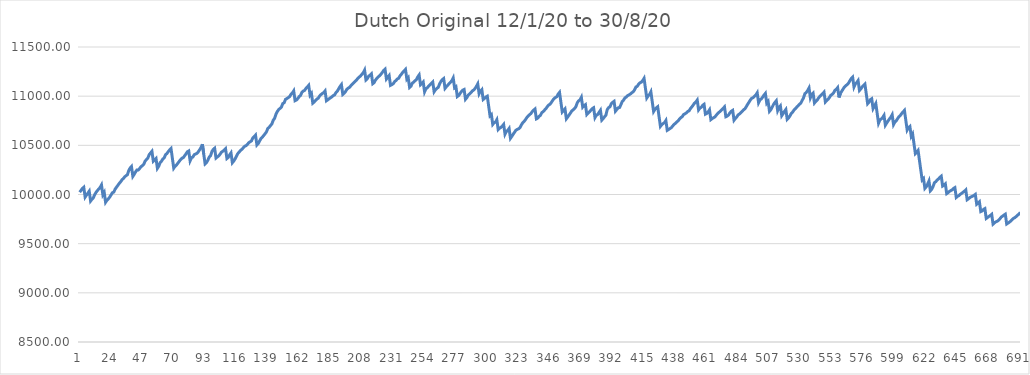
| Category | Series 0 |
|---|---|
| 0 | 10023.333 |
| 1 | 10042.179 |
| 2 | 10061.779 |
| 3 | 10073.644 |
| 4 | 9973.644 |
| 5 | 9994.948 |
| 6 | 10013.3 |
| 7 | 10033.717 |
| 8 | 9933.717 |
| 9 | 9952.001 |
| 10 | 9966.001 |
| 11 | 9998.667 |
| 12 | 10021.564 |
| 13 | 10040.302 |
| 14 | 10055.473 |
| 15 | 10072.225 |
| 16 | 10097.289 |
| 17 | 9997.289 |
| 18 | 10020.847 |
| 19 | 9920.847 |
| 20 | 9941.435 |
| 21 | 9955.375 |
| 22 | 9972.969 |
| 23 | 9995.041 |
| 24 | 10018.209 |
| 25 | 10024.968 |
| 26 | 10053.791 |
| 27 | 10074.642 |
| 28 | 10092.724 |
| 29 | 10112.602 |
| 30 | 10128.615 |
| 31 | 10148.615 |
| 32 | 10161.717 |
| 33 | 10179.217 |
| 34 | 10191.315 |
| 35 | 10200.233 |
| 36 | 10243.595 |
| 37 | 10269.25 |
| 38 | 10284.562 |
| 39 | 10184.562 |
| 40 | 10205.413 |
| 41 | 10229.913 |
| 42 | 10249.913 |
| 43 | 10249.913 |
| 44 | 10264.432 |
| 45 | 10283.278 |
| 46 | 10292.506 |
| 47 | 10306.918 |
| 48 | 10339.584 |
| 49 | 10355.391 |
| 50 | 10370.824 |
| 51 | 10405.21 |
| 52 | 10422.741 |
| 53 | 10439.351 |
| 54 | 10339.351 |
| 55 | 10353.174 |
| 56 | 10366.417 |
| 57 | 10266.417 |
| 58 | 10287.447 |
| 59 | 10324.851 |
| 60 | 10337.746 |
| 61 | 10361.08 |
| 62 | 10372.475 |
| 63 | 10405.583 |
| 64 | 10416.472 |
| 65 | 10436.431 |
| 66 | 10453.328 |
| 67 | 10467.572 |
| 68 | 10367.572 |
| 69 | 10267.572 |
| 70 | 10287.172 |
| 71 | 10299.123 |
| 72 | 10317.969 |
| 73 | 10336.852 |
| 74 | 10354.352 |
| 75 | 10369.178 |
| 76 | 10374.58 |
| 77 | 10394.219 |
| 78 | 10413.066 |
| 79 | 10434.51 |
| 80 | 10442.643 |
| 81 | 10342.643 |
| 82 | 10373.754 |
| 83 | 10380.425 |
| 84 | 10404.327 |
| 85 | 10411.327 |
| 86 | 10418.866 |
| 87 | 10433.943 |
| 88 | 10454.973 |
| 89 | 10477.245 |
| 90 | 10511.392 |
| 91 | 10411.392 |
| 92 | 10311.392 |
| 93 | 10324.287 |
| 94 | 10348.484 |
| 95 | 10380.097 |
| 96 | 10393.784 |
| 97 | 10437.34 |
| 98 | 10458.973 |
| 99 | 10470.838 |
| 100 | 10370.838 |
| 101 | 10382.702 |
| 102 | 10392.502 |
| 103 | 10410.065 |
| 104 | 10430.397 |
| 105 | 10439.73 |
| 106 | 10452.294 |
| 107 | 10465.905 |
| 108 | 10365.905 |
| 109 | 10377.118 |
| 110 | 10402.976 |
| 111 | 10423.058 |
| 112 | 10323.058 |
| 113 | 10339.954 |
| 114 | 10362.227 |
| 115 | 10390.227 |
| 116 | 10416.222 |
| 117 | 10430.87 |
| 118 | 10449.188 |
| 119 | 10458.968 |
| 120 | 10475.302 |
| 121 | 10490.472 |
| 122 | 10496.411 |
| 123 | 10508.661 |
| 124 | 10526.161 |
| 125 | 10535.695 |
| 126 | 10545.028 |
| 127 | 10574.815 |
| 128 | 10588.755 |
| 129 | 10603.926 |
| 130 | 10503.926 |
| 131 | 10518.64 |
| 132 | 10544.43 |
| 133 | 10570.219 |
| 134 | 10583.463 |
| 135 | 10600.359 |
| 136 | 10617.89 |
| 137 | 10636.664 |
| 138 | 10671.664 |
| 139 | 10683.457 |
| 140 | 10701.606 |
| 141 | 10717.939 |
| 142 | 10756.37 |
| 143 | 10774.518 |
| 144 | 10818.074 |
| 145 | 10844.56 |
| 146 | 10863.59 |
| 147 | 10876.058 |
| 148 | 10890.343 |
| 149 | 10924.729 |
| 150 | 10933.251 |
| 151 | 10967.88 |
| 152 | 10975.72 |
| 153 | 10984.922 |
| 154 | 10995.238 |
| 155 | 11019.14 |
| 156 | 11032.751 |
| 157 | 11054.056 |
| 158 | 10954.056 |
| 159 | 10960.857 |
| 160 | 10975.705 |
| 161 | 10995.305 |
| 162 | 11006.972 |
| 163 | 11038.182 |
| 164 | 11051.533 |
| 165 | 11059.031 |
| 166 | 11079.883 |
| 167 | 11093.126 |
| 168 | 11110.022 |
| 169 | 11010.022 |
| 170 | 11028.654 |
| 171 | 10928.654 |
| 172 | 10940.237 |
| 173 | 10956.932 |
| 174 | 10970.544 |
| 175 | 10979.247 |
| 176 | 11001.52 |
| 177 | 11015.931 |
| 178 | 11027.327 |
| 179 | 11036.236 |
| 180 | 11053.132 |
| 181 | 10953.132 |
| 182 | 10963.384 |
| 183 | 10973.333 |
| 184 | 10983.973 |
| 185 | 10993.307 |
| 186 | 11005.557 |
| 187 | 11013.479 |
| 188 | 11036.484 |
| 189 | 11051.002 |
| 190 | 11075.2 |
| 191 | 11099.338 |
| 192 | 11117.794 |
| 193 | 11017.794 |
| 194 | 11029.687 |
| 195 | 11046.583 |
| 196 | 11070.662 |
| 197 | 11081.515 |
| 198 | 11090.424 |
| 199 | 11107.32 |
| 200 | 11122.633 |
| 201 | 11136.244 |
| 202 | 11149.258 |
| 203 | 11162.153 |
| 204 | 11180.505 |
| 205 | 11193.134 |
| 206 | 11205.618 |
| 207 | 11221.952 |
| 208 | 11238.285 |
| 209 | 11265.061 |
| 210 | 11165.061 |
| 211 | 11178.672 |
| 212 | 11203.8 |
| 213 | 11213.342 |
| 214 | 11226.916 |
| 215 | 11126.916 |
| 216 | 11137.805 |
| 217 | 11164.291 |
| 218 | 11181.364 |
| 219 | 11196.213 |
| 220 | 11207.163 |
| 221 | 11223.915 |
| 222 | 11241.26 |
| 223 | 11261.935 |
| 224 | 11274.435 |
| 225 | 11174.435 |
| 226 | 11191.935 |
| 227 | 11209.818 |
| 228 | 11109.818 |
| 229 | 11117.078 |
| 230 | 11126.332 |
| 231 | 11147.636 |
| 232 | 11159.303 |
| 233 | 11174.615 |
| 234 | 11182.455 |
| 235 | 11206.833 |
| 236 | 11223.166 |
| 237 | 11242.766 |
| 238 | 11257.57 |
| 239 | 11272.419 |
| 240 | 11172.419 |
| 241 | 11188.752 |
| 242 | 11088.752 |
| 243 | 11101.252 |
| 244 | 11131.877 |
| 245 | 11143.272 |
| 246 | 11156.734 |
| 247 | 11167.409 |
| 248 | 11196.148 |
| 249 | 11215.748 |
| 250 | 11115.748 |
| 251 | 11127.998 |
| 252 | 11143.959 |
| 253 | 11043.959 |
| 254 | 11075.572 |
| 255 | 11085.372 |
| 256 | 11102.748 |
| 257 | 11115.643 |
| 258 | 11130.955 |
| 259 | 11144.566 |
| 260 | 11044.566 |
| 261 | 11065.111 |
| 262 | 11079.502 |
| 263 | 11089.292 |
| 264 | 11123.32 |
| 265 | 11150.317 |
| 266 | 11167.817 |
| 267 | 11179.226 |
| 268 | 11079.226 |
| 269 | 11096.269 |
| 270 | 11109.937 |
| 271 | 11128.783 |
| 272 | 11141.049 |
| 273 | 11158.549 |
| 274 | 11185.398 |
| 275 | 11085.398 |
| 276 | 11096.287 |
| 277 | 10996.287 |
| 278 | 11006.474 |
| 279 | 11026.891 |
| 280 | 11045.737 |
| 281 | 11061.569 |
| 282 | 11068.102 |
| 283 | 10968.102 |
| 284 | 10984.769 |
| 285 | 11010.491 |
| 286 | 11022.943 |
| 287 | 11035.872 |
| 288 | 11052.768 |
| 289 | 11062.348 |
| 290 | 11077.197 |
| 291 | 11099.219 |
| 292 | 11124.941 |
| 293 | 11024.941 |
| 294 | 11051.427 |
| 295 | 11066.435 |
| 296 | 10966.435 |
| 297 | 10977.83 |
| 298 | 10991.422 |
| 299 | 10999.77 |
| 300 | 10899.77 |
| 301 | 10799.77 |
| 302 | 10812.907 |
| 303 | 10712.907 |
| 304 | 10730.252 |
| 305 | 10735.852 |
| 306 | 10760.352 |
| 307 | 10660.352 |
| 308 | 10673.963 |
| 309 | 10682.171 |
| 310 | 10695.414 |
| 311 | 10712.883 |
| 312 | 10612.883 |
| 313 | 10640.645 |
| 314 | 10652.014 |
| 315 | 10671.381 |
| 316 | 10571.381 |
| 317 | 10590.981 |
| 318 | 10613.254 |
| 319 | 10633.419 |
| 320 | 10653.583 |
| 321 | 10662.492 |
| 322 | 10668.602 |
| 323 | 10680.283 |
| 324 | 10708.283 |
| 325 | 10729.313 |
| 326 | 10743.393 |
| 327 | 10760.893 |
| 328 | 10782.29 |
| 329 | 10798.957 |
| 330 | 10812.006 |
| 331 | 10822.968 |
| 332 | 10843.092 |
| 333 | 10857.828 |
| 334 | 10869.371 |
| 335 | 10769.371 |
| 336 | 10776.631 |
| 337 | 10794.449 |
| 338 | 10805.278 |
| 339 | 10832.5 |
| 340 | 10843.305 |
| 341 | 10858.428 |
| 342 | 10873.254 |
| 343 | 10892.893 |
| 344 | 10909.79 |
| 345 | 10917.95 |
| 346 | 10936.098 |
| 347 | 10957.876 |
| 348 | 10975.957 |
| 349 | 10986.738 |
| 350 | 10994.578 |
| 351 | 11021.136 |
| 352 | 11038.636 |
| 353 | 10938.636 |
| 354 | 10838.636 |
| 355 | 10853.69 |
| 356 | 10870.272 |
| 357 | 10770.272 |
| 358 | 10788.868 |
| 359 | 10807.971 |
| 360 | 10828.388 |
| 361 | 10850.41 |
| 362 | 10860.309 |
| 363 | 10873.661 |
| 364 | 10893.261 |
| 365 | 10932.461 |
| 366 | 10952.878 |
| 367 | 10962.211 |
| 368 | 10988.484 |
| 369 | 10888.484 |
| 370 | 10903.089 |
| 371 | 10913.537 |
| 372 | 10813.537 |
| 373 | 10828.408 |
| 374 | 10840.433 |
| 375 | 10857.933 |
| 376 | 10873.245 |
| 377 | 10882.179 |
| 378 | 10782.179 |
| 379 | 10806.081 |
| 380 | 10813.978 |
| 381 | 10835.951 |
| 382 | 10856.67 |
| 383 | 10756.67 |
| 384 | 10771.082 |
| 385 | 10790.682 |
| 386 | 10806.287 |
| 387 | 10863.934 |
| 388 | 10883.534 |
| 389 | 10892.056 |
| 390 | 10923.668 |
| 391 | 10937.549 |
| 392 | 10947.489 |
| 393 | 10847.489 |
| 394 | 10864.385 |
| 395 | 10881.253 |
| 396 | 10884.632 |
| 397 | 10912.874 |
| 398 | 10946.551 |
| 399 | 10960.795 |
| 400 | 10983.068 |
| 401 | 10991.068 |
| 402 | 11006.38 |
| 403 | 11013.292 |
| 404 | 11022.554 |
| 405 | 11034.743 |
| 406 | 11044.543 |
| 407 | 11063.21 |
| 408 | 11092.817 |
| 409 | 11099.768 |
| 410 | 11121.84 |
| 411 | 11136.125 |
| 412 | 11142.707 |
| 413 | 11158.746 |
| 414 | 11181.019 |
| 415 | 11081.019 |
| 416 | 10981.019 |
| 417 | 11001.87 |
| 418 | 11016.052 |
| 419 | 11043.893 |
| 420 | 10943.893 |
| 421 | 10843.893 |
| 422 | 10866.684 |
| 423 | 10881.443 |
| 424 | 10892.467 |
| 425 | 10792.467 |
| 426 | 10692.467 |
| 427 | 10709.967 |
| 428 | 10721.429 |
| 429 | 10730.762 |
| 430 | 10752.637 |
| 431 | 10652.637 |
| 432 | 10661.159 |
| 433 | 10670.301 |
| 434 | 10680.101 |
| 435 | 10696.434 |
| 436 | 10712.795 |
| 437 | 10722.846 |
| 438 | 10737.173 |
| 439 | 10749.594 |
| 440 | 10767.316 |
| 441 | 10782.164 |
| 442 | 10791.497 |
| 443 | 10813.275 |
| 444 | 10820.196 |
| 445 | 10829.996 |
| 446 | 10843.996 |
| 447 | 10850.529 |
| 448 | 10873.697 |
| 449 | 10890.031 |
| 450 | 10908.697 |
| 451 | 10929.286 |
| 452 | 10940.952 |
| 453 | 10960.244 |
| 454 | 10860.244 |
| 455 | 10879.09 |
| 456 | 10887.256 |
| 457 | 10906.856 |
| 458 | 10917.172 |
| 459 | 10817.172 |
| 460 | 10824.557 |
| 461 | 10839.87 |
| 462 | 10861.456 |
| 463 | 10761.456 |
| 464 | 10772.344 |
| 465 | 10780.866 |
| 466 | 10789.249 |
| 467 | 10806.749 |
| 468 | 10823.646 |
| 469 | 10836.21 |
| 470 | 10847.346 |
| 471 | 10862.659 |
| 472 | 10876.659 |
| 473 | 10891.071 |
| 474 | 10791.071 |
| 475 | 10797.829 |
| 476 | 10808.966 |
| 477 | 10831.088 |
| 478 | 10846.4 |
| 479 | 10855.542 |
| 480 | 10755.542 |
| 481 | 10773.36 |
| 482 | 10788.649 |
| 483 | 10809.368 |
| 484 | 10819.168 |
| 485 | 10831.716 |
| 486 | 10847.028 |
| 487 | 10861.461 |
| 488 | 10871.261 |
| 489 | 10893.584 |
| 490 | 10917.663 |
| 491 | 10939.249 |
| 492 | 10962.582 |
| 493 | 10978.648 |
| 494 | 10984.773 |
| 495 | 11000.085 |
| 496 | 11012.335 |
| 497 | 11034.113 |
| 498 | 10934.113 |
| 499 | 10961.875 |
| 500 | 10972.191 |
| 501 | 10989.881 |
| 502 | 11011.001 |
| 503 | 11028.164 |
| 504 | 10928.164 |
| 505 | 10945.854 |
| 506 | 10845.854 |
| 507 | 10862.187 |
| 508 | 10889.11 |
| 509 | 10916.484 |
| 510 | 10936.901 |
| 511 | 10953.399 |
| 512 | 10853.399 |
| 513 | 10884.412 |
| 514 | 10901.309 |
| 515 | 10801.309 |
| 516 | 10821.556 |
| 517 | 10845.635 |
| 518 | 10864.481 |
| 519 | 10764.481 |
| 520 | 10778.542 |
| 521 | 10798.789 |
| 522 | 10824.444 |
| 523 | 10838.709 |
| 524 | 10858.999 |
| 525 | 10871.996 |
| 526 | 10888.893 |
| 527 | 10902.136 |
| 528 | 10918.307 |
| 529 | 10929.611 |
| 530 | 10957.611 |
| 531 | 10983.814 |
| 532 | 11025.516 |
| 533 | 11038.08 |
| 534 | 11057.799 |
| 535 | 11083.253 |
| 536 | 10983.253 |
| 537 | 11016.25 |
| 538 | 11030.747 |
| 539 | 10930.747 |
| 540 | 10947.643 |
| 541 | 10959.832 |
| 542 | 10981.61 |
| 543 | 10998.507 |
| 544 | 11012.648 |
| 545 | 11025.261 |
| 546 | 11040.694 |
| 547 | 10940.694 |
| 548 | 10955.817 |
| 549 | 10968.238 |
| 550 | 10987.084 |
| 551 | 11009.107 |
| 552 | 11019.137 |
| 553 | 11033.218 |
| 554 | 11059.704 |
| 555 | 11069.593 |
| 556 | 11087.093 |
| 557 | 10987.093 |
| 558 | 11027.589 |
| 559 | 11050.433 |
| 560 | 11072.211 |
| 561 | 11093.989 |
| 562 | 11107.003 |
| 563 | 11117.892 |
| 564 | 11133.205 |
| 565 | 11157.705 |
| 566 | 11178.78 |
| 567 | 11193.628 |
| 568 | 11093.628 |
| 569 | 11124.253 |
| 570 | 11137.733 |
| 571 | 11158.15 |
| 572 | 11058.15 |
| 573 | 11073.181 |
| 574 | 11094.032 |
| 575 | 11109.344 |
| 576 | 11123.486 |
| 577 | 11023.486 |
| 578 | 10923.486 |
| 579 | 10939.343 |
| 580 | 10964.472 |
| 581 | 10973.52 |
| 582 | 10873.52 |
| 583 | 10898.909 |
| 584 | 10924.904 |
| 585 | 10824.904 |
| 586 | 10724.904 |
| 587 | 10756.93 |
| 588 | 10769.104 |
| 589 | 10783.024 |
| 590 | 10804.802 |
| 591 | 10704.802 |
| 592 | 10727.331 |
| 593 | 10748.451 |
| 594 | 10769.04 |
| 595 | 10785.65 |
| 596 | 10811.104 |
| 597 | 10711.104 |
| 598 | 10736.894 |
| 599 | 10749.926 |
| 600 | 10771.752 |
| 601 | 10791.917 |
| 602 | 10804.244 |
| 603 | 10824.162 |
| 604 | 10839.718 |
| 605 | 10855.524 |
| 606 | 10755.524 |
| 607 | 10655.524 |
| 608 | 10679.369 |
| 609 | 10691.965 |
| 610 | 10591.965 |
| 611 | 10616.283 |
| 612 | 10516.283 |
| 613 | 10416.283 |
| 614 | 10430.694 |
| 615 | 10448.163 |
| 616 | 10348.163 |
| 617 | 10248.163 |
| 618 | 10148.163 |
| 619 | 10162.325 |
| 620 | 10062.325 |
| 621 | 10078.604 |
| 622 | 10105.601 |
| 623 | 10137.523 |
| 624 | 10037.523 |
| 625 | 10052.372 |
| 626 | 10082.069 |
| 627 | 10120.201 |
| 628 | 10130.506 |
| 629 | 10147.004 |
| 630 | 10158.561 |
| 631 | 10174.522 |
| 632 | 10186.272 |
| 633 | 10086.272 |
| 634 | 10096.072 |
| 635 | 10108.701 |
| 636 | 10008.701 |
| 637 | 10018.501 |
| 638 | 10031.13 |
| 639 | 10039.652 |
| 640 | 10047.19 |
| 641 | 10061.905 |
| 642 | 10070.317 |
| 643 | 9970.317 |
| 644 | 9981.984 |
| 645 | 9988.31 |
| 646 | 10002.31 |
| 647 | 10012.351 |
| 648 | 10023.24 |
| 649 | 10033.699 |
| 650 | 10046.783 |
| 651 | 9946.783 |
| 652 | 9956.642 |
| 653 | 9968.711 |
| 654 | 9977.131 |
| 655 | 9982.865 |
| 656 | 9990.195 |
| 657 | 10001.194 |
| 658 | 9901.194 |
| 659 | 9913.073 |
| 660 | 9925.967 |
| 661 | 9825.967 |
| 662 | 9832.726 |
| 663 | 9848.609 |
| 664 | 9856.702 |
| 665 | 9756.702 |
| 666 | 9766.621 |
| 667 | 9777.25 |
| 668 | 9786.637 |
| 669 | 9798.573 |
| 670 | 9698.573 |
| 671 | 9711.057 |
| 672 | 9721.946 |
| 673 | 9727.992 |
| 674 | 9736.901 |
| 675 | 9752.606 |
| 676 | 9770.328 |
| 677 | 9780.128 |
| 678 | 9790.336 |
| 679 | 9799.814 |
| 680 | 9699.814 |
| 681 | 9709.112 |
| 682 | 9718.912 |
| 683 | 9730.578 |
| 684 | 9743.473 |
| 685 | 9757.218 |
| 686 | 9764.57 |
| 687 | 9776.713 |
| 688 | 9789.957 |
| 689 | 9801.221 |
| 690 | 9817.609 |